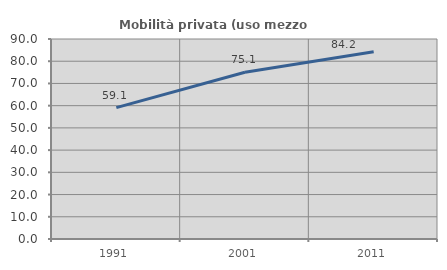
| Category | Mobilità privata (uso mezzo privato) |
|---|---|
| 1991.0 | 59.14 |
| 2001.0 | 75.053 |
| 2011.0 | 84.23 |